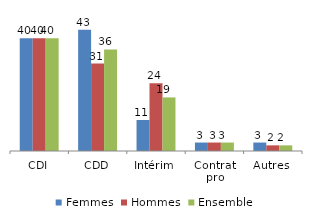
| Category | Femmes | Hommes | Ensemble |
|---|---|---|---|
| CDI | 40 | 40 | 40 |
| CDD | 43 | 31 | 36 |
| Intérim | 11 | 24 | 19 |
| Contrat
pro | 3 | 3 | 3 |
| Autres | 3 | 2 | 2 |